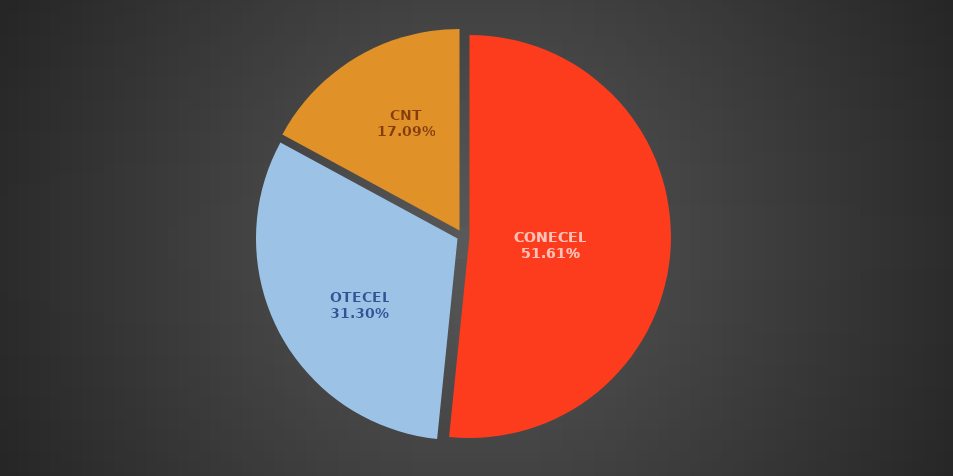
| Category | Dic 2021 |
|---|---|
| CONECEL | 8665715 |
| OTECEL | 5254468 |
| CNT | 2869417 |